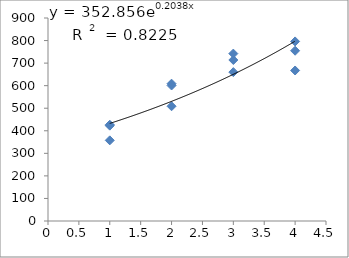
| Category | Series 0 |
|---|---|
| 1.0 | 426.695 |
| 1.0 | 357.554 |
| 1.0 | 422.744 |
| 2.0 | 608.822 |
| 2.0 | 600.812 |
| 2.0 | 508.687 |
| 3.0 | 660.039 |
| 3.0 | 742.19 |
| 3.0 | 713.862 |
| 4.0 | 667.289 |
| 4.0 | 796.109 |
| 4.0 | 754.886 |